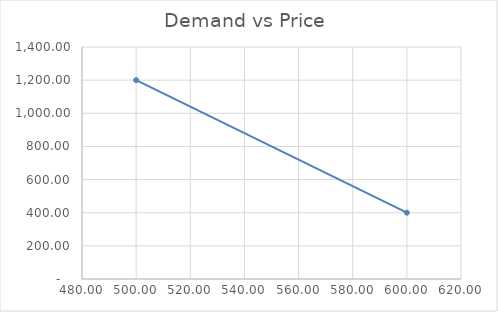
| Category | Series 0 |
|---|---|
| 600.0 | 400 |
| 500.0 | 1200 |